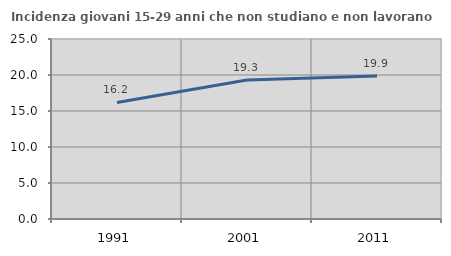
| Category | Incidenza giovani 15-29 anni che non studiano e non lavorano  |
|---|---|
| 1991.0 | 16.195 |
| 2001.0 | 19.316 |
| 2011.0 | 19.877 |